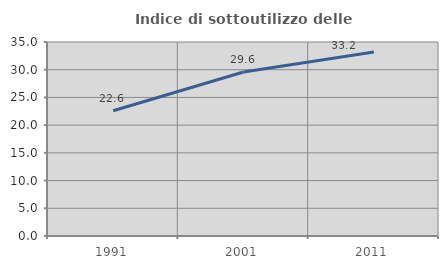
| Category | Indice di sottoutilizzo delle abitazioni  |
|---|---|
| 1991.0 | 22.602 |
| 2001.0 | 29.596 |
| 2011.0 | 33.185 |